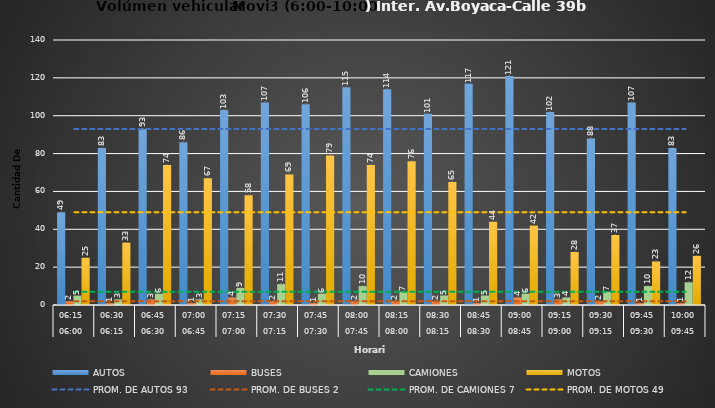
| Category | AUTOS | BUSES | CAMIONES | MOTOS |
|---|---|---|---|---|
| 0 | 49 | 2 | 5 | 25 |
| 1 | 83 | 1 | 3 | 33 |
| 2 | 93 | 3 | 6 | 74 |
| 3 | 86 | 1 | 3 | 67 |
| 4 | 103 | 4 | 9 | 58 |
| 5 | 107 | 2 | 11 | 69 |
| 6 | 106 | 1 | 6 | 79 |
| 7 | 115 | 2 | 10 | 74 |
| 8 | 114 | 2 | 7 | 76 |
| 9 | 101 | 2 | 5 | 65 |
| 10 | 117 | 1 | 5 | 44 |
| 11 | 121 | 4 | 6 | 42 |
| 12 | 102 | 3 | 4 | 28 |
| 13 | 88 | 2 | 7 | 37 |
| 14 | 107 | 1 | 10 | 23 |
| 15 | 83 | 1 | 12 | 26 |